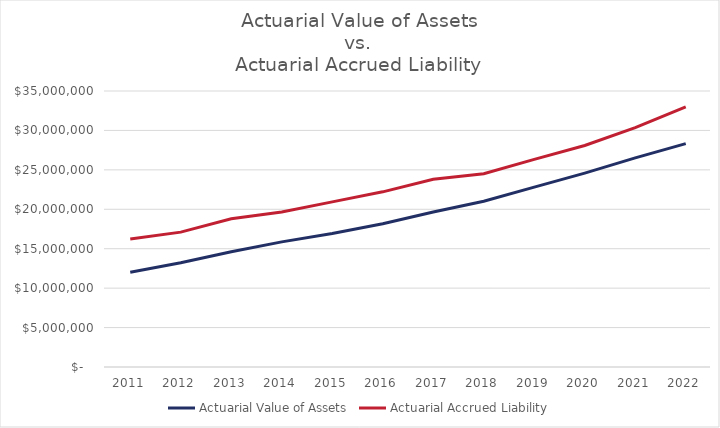
| Category | Actuarial Value of Assets | Actuarial Accrued Liability |
|---|---|---|
| 2011.0 | 12021178 | 16232853 |
| 2012.0 | 13217340 | 17103285 |
| 2013.0 | 14620633 | 18808863 |
| 2014.0 | 15868419 | 19649872 |
| 2015.0 | 16936318 | 20936882 |
| 2016.0 | 18161325 | 22211672 |
| 2017.0 | 19656881 | 23814748 |
| 2018.0 | 21024016 | 24507823 |
| 2019.0 | 22803461 | 26322661 |
| 2020.0 | 24583214 | 28094661 |
| 2021.0 | 26515436 | 30349489 |
| 2022.0 | 28325201 | 32996875 |